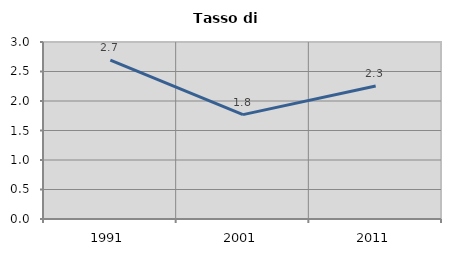
| Category | Tasso di disoccupazione   |
|---|---|
| 1991.0 | 2.694 |
| 2001.0 | 1.769 |
| 2011.0 | 2.254 |